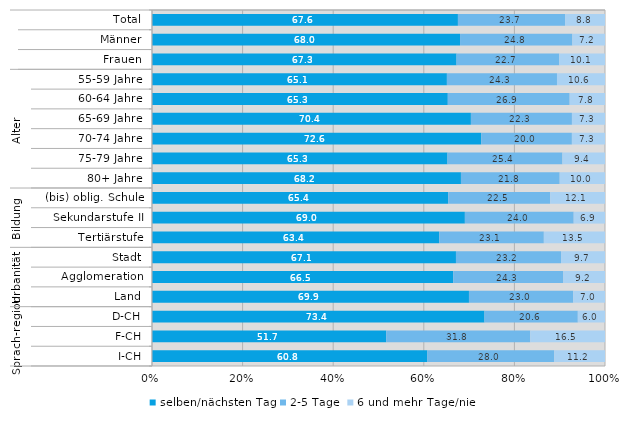
| Category | selben/nächsten Tag | 2-5 Tage | 6 und mehr Tage/nie |
|---|---|---|---|
| 0 | 67.6 | 23.7 | 8.8 |
| 1 | 68 | 24.8 | 7.2 |
| 2 | 67.3 | 22.7 | 10.1 |
| 3 | 65.1 | 24.3 | 10.6 |
| 4 | 65.3 | 26.9 | 7.8 |
| 5 | 70.4 | 22.3 | 7.3 |
| 6 | 72.6 | 20 | 7.3 |
| 7 | 65.3 | 25.4 | 9.4 |
| 8 | 68.2 | 21.8 | 10 |
| 9 | 65.4 | 22.5 | 12.1 |
| 10 | 69 | 24 | 6.9 |
| 11 | 63.4 | 23.1 | 13.5 |
| 12 | 67.1 | 23.2 | 9.7 |
| 13 | 66.5 | 24.3 | 9.2 |
| 14 | 69.9 | 23 | 7 |
| 15 | 73.4 | 20.6 | 6 |
| 16 | 51.7 | 31.8 | 16.5 |
| 17 | 60.8 | 28 | 11.2 |